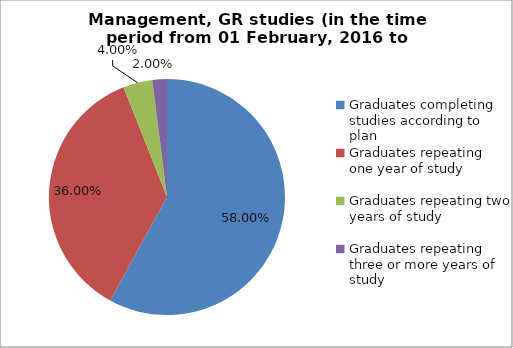
| Category | Series 0 |
|---|---|
| Graduates completing studies according to plan | 58 |
| Graduates repeating one year of study | 36 |
| Graduates repeating two years of study | 4 |
| Graduates repeating three or more years of study | 2 |